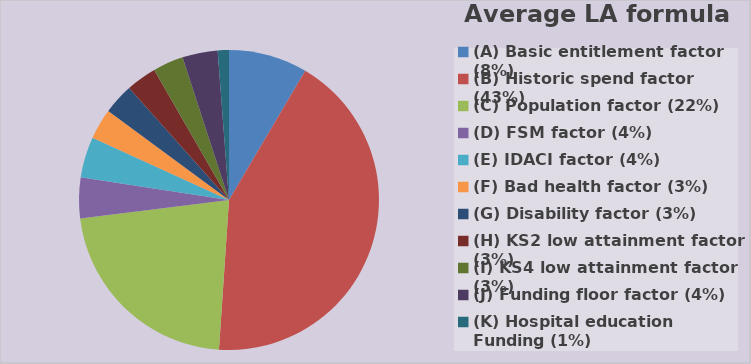
| Category | Series 0 |
|---|---|
| (A) Basic entitlement factor (8%) | 0.085 |
| (B) Historic spend factor (43%) | 0.426 |
| (C) Population factor (22%) | 0.22 |
| (D) FSM factor (4%) | 0.044 |
| (E) IDACI factor (4%) | 0.044 |
| (F) Bad health factor (3%) | 0.033 |
| (G) Disability factor (3%) | 0.033 |
| (H) KS2 low attainment factor (3%) | 0.033 |
| (I) KS4 low attainment factor (3%) | 0.033 |
| (J) Funding floor factor (4%) | 0.038 |
| (K) Hospital education Funding (1%) | 0.012 |